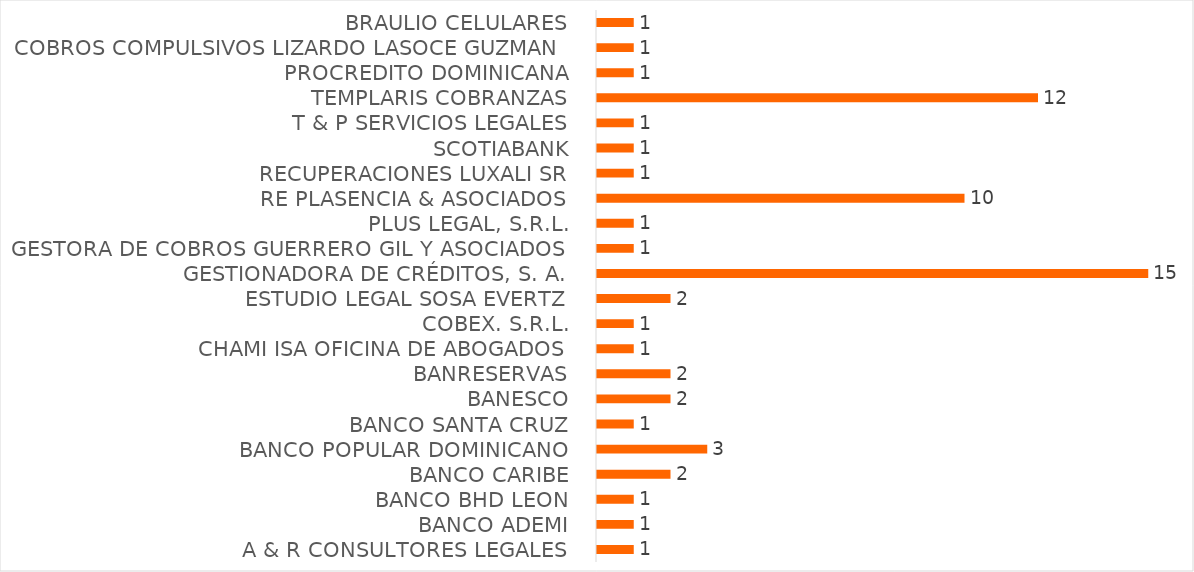
| Category | CANTIDAD DE CASOS |
|---|---|
| A & R CONSULTORES LEGALES | 1 |
| BANCO ADEMI | 1 |
| BANCO BHD LEON | 1 |
| BANCO CARIBE | 2 |
| BANCO POPULAR DOMINICANO | 3 |
| BANCO SANTA CRUZ | 1 |
| BANESCO | 2 |
| BANRESERVAS | 2 |
| CHAMI ISA OFICINA DE ABOGADOS | 1 |
| COBEX. S.R.L. | 1 |
| ESTUDIO LEGAL SOSA EVERTZ | 2 |
| GESTIONADORA DE CRÉDITOS, S. A. | 15 |
| GESTORA DE COBROS GUERRERO GIL Y ASOCIADOS | 1 |
| PLUS LEGAL, S.R.L. | 1 |
| RE PLASENCIA & ASOCIADOS | 10 |
| RECUPERACIONES LUXALI SR | 1 |
| SCOTIABANK | 1 |
| T & P SERVICIOS LEGALES | 1 |
| TEMPLARIS COBRANZAS | 12 |
| PROCREDITO DOMINICANA | 1 |
| COBROS COMPULSIVOS LIZARDO LASOCE GUZMAN  | 1 |
| BRAULIO CELULARES | 1 |